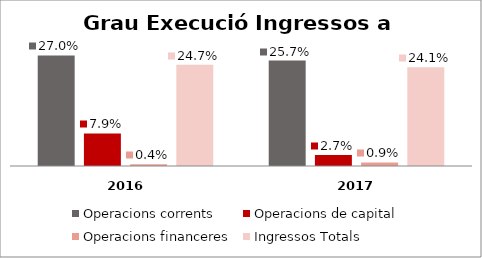
| Category | Operacions corrents | Operacions de capital | Operacions financeres | Ingressos Totals |
|---|---|---|---|---|
| 0 | 0.27 | 0.079 | 0.004 | 0.247 |
| 1 | 0.257 | 0.027 | 0.009 | 0.241 |